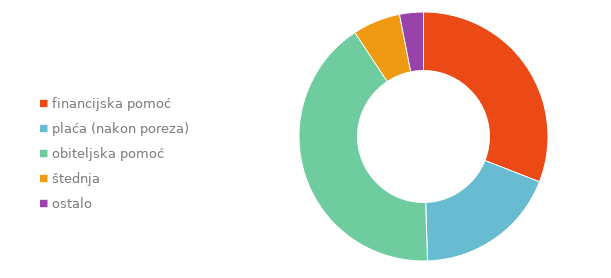
| Category | Series 0 |
|---|---|
| financijska pomoć | 0.309 |
| plaća (nakon poreza) | 0.186 |
| obiteljska pomoć | 0.412 |
| štednja | 0.062 |
| ostalo | 0.031 |